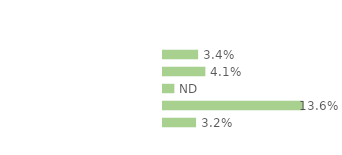
| Category | Series 0 |
|---|---|
| Personnes en emploi¹ | 0.034 |
| Chômeuses | 0.041 |
| Retraitées | 0.011 |
| Étudiantes, élèves | 0.136 |
| Autres inactifs  | 0.032 |